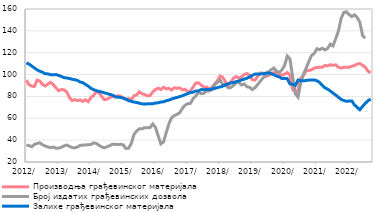
| Category | Производња грађевинског материјала |
|---|---|
| 2012-01-01 | 94.99 |
| 2012-02-01 | 90.663 |
| 2012-03-01 | 89.512 |
| 2012-04-01 | 89.028 |
| 2012-05-01 | 94.92 |
| 2012-06-01 | 94.101 |
| 2012-07-01 | 91.036 |
| 2012-08-01 | 89.582 |
| 2012-09-01 | 91.387 |
| 2012-10-01 | 92.871 |
| 2012-11-01 | 90.883 |
| 2012-12-01 | 87.975 |
| 2013-01-01 | 85.139 |
| 2013-02-01 | 86.375 |
| 2013-03-01 | 86.048 |
| 2013-04-01 | 84.217 |
| 2013-05-01 | 79.039 |
| 2013-06-01 | 76.251 |
| 2013-07-01 | 77.107 |
| 2013-08-01 | 76.217 |
| 2013-09-01 | 76.72 |
| 2013-10-01 | 75.463 |
| 2013-11-01 | 76.867 |
| 2013-12-01 | 75.2 |
| 2014-01-01 | 79.063 |
| 2014-02-01 | 80.909 |
| 2014-03-01 | 84.527 |
| 2014-04-01 | 83.303 |
| 2014-05-01 | 79.908 |
| 2014-06-01 | 77.043 |
| 2014-07-01 | 77.515 |
| 2014-08-01 | 78.798 |
| 2014-09-01 | 80.038 |
| 2014-10-01 | 79.359 |
| 2014-11-01 | 80.672 |
| 2014-12-01 | 80.148 |
| 2015-01-01 | 78.842 |
| 2015-02-01 | 77.228 |
| 2015-03-01 | 78.082 |
| 2015-04-01 | 76.722 |
| 2015-05-01 | 80.586 |
| 2015-06-01 | 81.397 |
| 2015-07-01 | 84.237 |
| 2015-08-01 | 82.508 |
| 2015-09-01 | 81.715 |
| 2015-10-01 | 80.467 |
| 2015-11-01 | 80.789 |
| 2015-12-01 | 84.103 |
| 2016-01-01 | 86.219 |
| 2016-02-01 | 87.579 |
| 2016-03-01 | 86.332 |
| 2016-04-01 | 88.392 |
| 2016-05-01 | 86.921 |
| 2016-06-01 | 87.504 |
| 2016-07-01 | 85.864 |
| 2016-08-01 | 87.988 |
| 2016-09-01 | 87.454 |
| 2016-10-01 | 87.888 |
| 2016-11-01 | 86.029 |
| 2016-12-01 | 86.506 |
| 2017-01-01 | 84.187 |
| 2017-02-01 | 84.975 |
| 2017-03-01 | 88.522 |
| 2017-04-01 | 92.264 |
| 2017-05-01 | 92.438 |
| 2017-06-01 | 90.498 |
| 2017-07-01 | 88.258 |
| 2017-08-01 | 88.557 |
| 2017-09-01 | 86.75 |
| 2017-10-01 | 88.47 |
| 2017-11-01 | 91.351 |
| 2017-12-01 | 94.271 |
| 2018-01-01 | 98.62 |
| 2018-02-01 | 97.512 |
| 2018-03-01 | 93.586 |
| 2018-04-01 | 89.958 |
| 2018-05-01 | 92.956 |
| 2018-06-01 | 96.769 |
| 2018-07-01 | 98.097 |
| 2018-08-01 | 96.779 |
| 2018-09-01 | 97.942 |
| 2018-10-31 | 100.209 |
| 2018-11-30 | 100.886 |
| 2018-12-31 | 99.234 |
| 2019-01-31 | 95.278 |
| 2019-02-28 | 94.922 |
| 2019-03-31 | 98.32 |
| 2019-04-30 | 101.421 |
| 2019-05-31 | 101.293 |
| 2019-06-30 | 98.45 |
| 2019-07-31 | 98.963 |
| 2019-08-31 | 100.824 |
| 2019-09-30 | 101.703 |
| 2019-10-31 | 102.017 |
| 2019-11-30 | 100.404 |
| 2019-12-31 | 99.402 |
| 2020-01-31 | 100.487 |
| 2020-02-29 | 101.913 |
| 2020-03-31 | 99.47 |
| 2020-04-30 | 86.524 |
| 2020-05-31 | 83.834 |
| 2020-06-30 | 85.64 |
| 2020-07-31 | 96.654 |
| 2020-08-31 | 99.145 |
| 2020-09-30 | 103.26 |
| 2020-10-31 | 103.807 |
| 2020-11-30 | 104.31 |
| 2020-12-31 | 105.901 |
| 2021-01-31 | 106.545 |
| 2021-02-28 | 106.656 |
| 2021-03-31 | 106.689 |
| 2021-04-30 | 108.306 |
| 2021-05-31 | 107.949 |
| 2021-06-30 | 108.996 |
| 2021-07-31 | 108.484 |
| 2021-08-31 | 108.968 |
| 2021-09-30 | 106.716 |
| 2021-10-31 | 105.945 |
| 2021-11-30 | 106.595 |
| 2021-12-31 | 106.631 |
| 2022-01-31 | 106.652 |
| 2022-02-28 | 107.596 |
| 2022-03-31 | 108.242 |
| 2022-04-30 | 109.649 |
| 2022-05-31 | 110.164 |
| 2022-06-30 | 108.543 |
| 2022-07-31 | 106.753 |
| 2022-08-31 | 103.087 |
| 2022-09-30 | 101.634 |